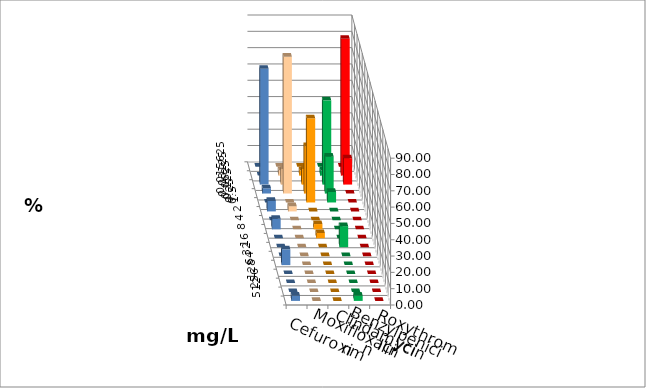
| Category | Cefuroxim | Moxifloxacin | Clindamycin | Benzylpenicillin | Roxythromycin |
|---|---|---|---|---|---|
| 0.015625 | 0 | 0 | 0 | 0 | 0 |
| 0.03125 | 3.226 | 3.226 | 3.226 | 83.871 | 0 |
| 0.0625 | 9.677 | 9.677 | 51.613 | 16.129 | 70.968 |
| 0.125 | 83.871 | 29.032 | 22.581 | 0 | 3.226 |
| 0.25 | 0 | 51.613 | 6.452 | 0 | 0 |
| 0.5 | 3.226 | 0 | 0 | 0 | 6.452 |
| 1.0 | 0 | 0 | 0 | 0 | 0 |
| 2.0 | 0 | 3.226 | 0 | 0 | 6.452 |
| 4.0 | 0 | 3.226 | 0 | 0 | 0 |
| 8.0 | 0 | 0 | 12.903 | 0 | 0 |
| 16.0 | 0 | 0 | 0 | 0 | 0 |
| 32.0 | 0 | 0 | 0 | 0 | 9.677 |
| 64.0 | 0 | 0 | 0 | 0 | 0 |
| 128.0 | 0 | 0 | 0 | 0 | 0 |
| 256.0 | 0 | 0 | 0 | 0 | 0 |
| 512.0 | 0 | 0 | 3.226 | 0 | 3.226 |